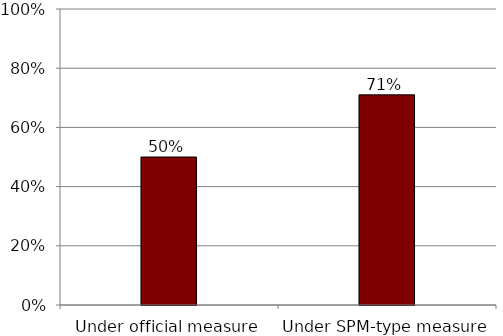
| Category | Series 0 |
|---|---|
| Under official measure | 0.5 |
| Under SPM-type measure | 0.71 |